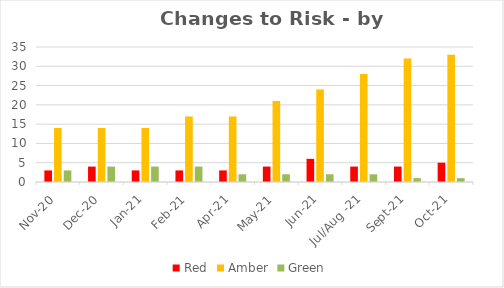
| Category | Red | Amber | Green |
|---|---|---|---|
| Nov-20 | 3 | 14 | 3 |
| Dec-20 | 4 | 14 | 4 |
| Jan-21 | 3 | 14 | 4 |
| Feb-21 | 3 | 17 | 4 |
| Apr-21 | 3 | 17 | 2 |
| May-21 | 4 | 21 | 2 |
| Jun-21 | 6 | 24 | 2 |
| Jul/Aug -21 | 4 | 28 | 2 |
| Sep-21 | 4 | 32 | 1 |
| Oct-21 | 5 | 33 | 1 |